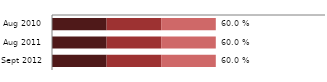
| Category | Severe (<7.0 g/dl) | Moderate (7.0-9.9 g/dl) | Mild (10.0-10.9 g/dl) | Total anaemia |
|---|---|---|---|---|
| 2010-08-01 | 0.2 | 0.2 | 0.2 | 0.6 |
| 2011-08-01 | 0.2 | 0.2 | 0.2 | 0.6 |
| 2012-09-01 | 0.2 | 0.2 | 0.2 | 0.6 |